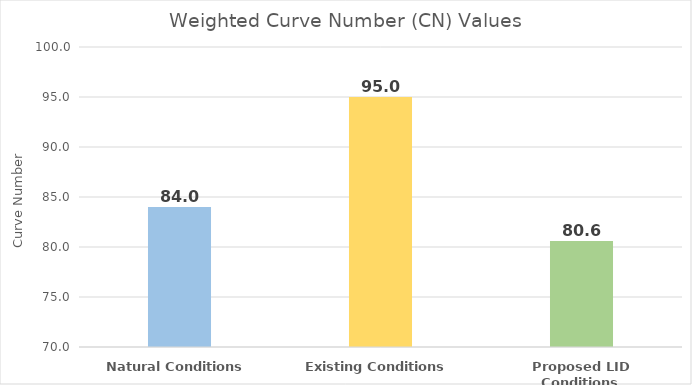
| Category | CN Value |
|---|---|
| Natural Conditions | 84 |
| Existing Conditions | 95 |
| Proposed LID Conditions | 80.6 |